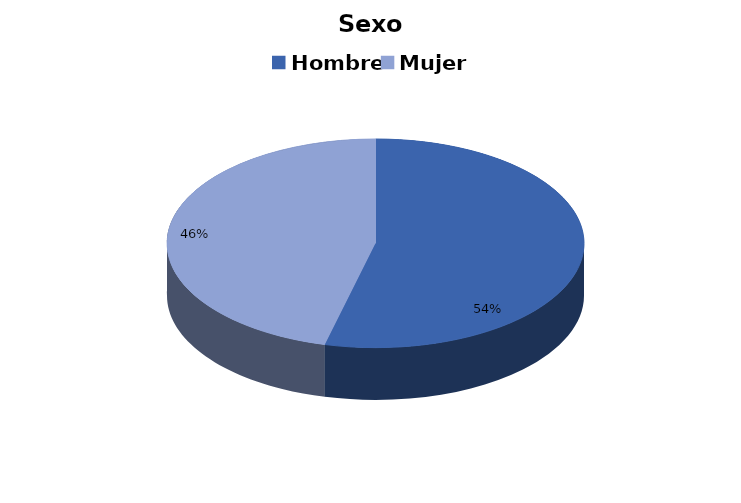
| Category | Sexo |
|---|---|
| Hombre | 138 |
| Mujer | 118 |